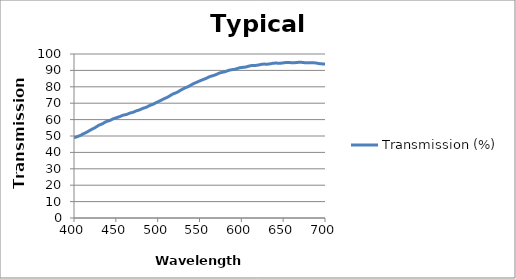
| Category | Transmission (%) |
|---|---|
| 400.0 | 48.969 |
| 401.0 | 49.126 |
| 402.0 | 49.299 |
| 403.0 | 49.397 |
| 404.0 | 49.608 |
| 405.0 | 49.88 |
| 406.0 | 50.022 |
| 407.0 | 50.184 |
| 408.0 | 50.443 |
| 409.0 | 50.691 |
| 410.0 | 51.057 |
| 411.0 | 51.306 |
| 412.0 | 51.488 |
| 413.0 | 51.73 |
| 414.0 | 51.988 |
| 415.0 | 52.292 |
| 416.0 | 52.523 |
| 417.0 | 52.855 |
| 418.0 | 53.106 |
| 419.0 | 53.479 |
| 420.0 | 53.699 |
| 421.0 | 54.022 |
| 422.0 | 54.271 |
| 423.0 | 54.49 |
| 424.0 | 54.793 |
| 425.0 | 55.041 |
| 426.0 | 55.361 |
| 427.0 | 55.71 |
| 428.0 | 55.965 |
| 429.0 | 56.387 |
| 430.0 | 56.599 |
| 431.0 | 56.843 |
| 432.0 | 57.021 |
| 433.0 | 57.22 |
| 434.0 | 57.468 |
| 435.0 | 57.75 |
| 436.0 | 58.072 |
| 437.0 | 58.378 |
| 438.0 | 58.632 |
| 439.0 | 58.861 |
| 440.0 | 59.04 |
| 441.0 | 59.185 |
| 442.0 | 59.311 |
| 443.0 | 59.518 |
| 444.0 | 59.762 |
| 445.0 | 60.007 |
| 446.0 | 60.314 |
| 447.0 | 60.477 |
| 448.0 | 60.676 |
| 449.0 | 60.856 |
| 450.0 | 60.983 |
| 451.0 | 61.18 |
| 452.0 | 61.387 |
| 453.0 | 61.524 |
| 454.0 | 61.702 |
| 455.0 | 61.891 |
| 456.0 | 62.113 |
| 457.0 | 62.354 |
| 458.0 | 62.517 |
| 459.0 | 62.737 |
| 460.0 | 62.84 |
| 461.0 | 62.902 |
| 462.0 | 63.05 |
| 463.0 | 63.176 |
| 464.0 | 63.352 |
| 465.0 | 63.607 |
| 466.0 | 63.81 |
| 467.0 | 63.988 |
| 468.0 | 64.146 |
| 469.0 | 64.267 |
| 470.0 | 64.388 |
| 471.0 | 64.555 |
| 472.0 | 64.759 |
| 473.0 | 65.001 |
| 474.0 | 65.219 |
| 475.0 | 65.399 |
| 476.0 | 65.549 |
| 477.0 | 65.713 |
| 478.0 | 65.88 |
| 479.0 | 66.057 |
| 480.0 | 66.305 |
| 481.0 | 66.548 |
| 482.0 | 66.776 |
| 483.0 | 66.97 |
| 484.0 | 67.118 |
| 485.0 | 67.274 |
| 486.0 | 67.442 |
| 487.0 | 67.683 |
| 488.0 | 67.94 |
| 489.0 | 68.234 |
| 490.0 | 68.466 |
| 491.0 | 68.685 |
| 492.0 | 68.907 |
| 493.0 | 69.094 |
| 494.0 | 69.261 |
| 495.0 | 69.465 |
| 496.0 | 69.738 |
| 497.0 | 69.998 |
| 498.0 | 70.298 |
| 499.0 | 70.531 |
| 500.0 | 70.778 |
| 501.0 | 71.035 |
| 502.0 | 71.275 |
| 503.0 | 71.514 |
| 504.0 | 71.746 |
| 505.0 | 72.029 |
| 506.0 | 72.308 |
| 507.0 | 72.534 |
| 508.0 | 72.793 |
| 509.0 | 73.02 |
| 510.0 | 73.249 |
| 511.0 | 73.473 |
| 512.0 | 73.748 |
| 513.0 | 74.014 |
| 514.0 | 74.325 |
| 515.0 | 74.634 |
| 516.0 | 74.959 |
| 517.0 | 75.263 |
| 518.0 | 75.541 |
| 519.0 | 75.769 |
| 520.0 | 75.959 |
| 521.0 | 76.16 |
| 522.0 | 76.377 |
| 523.0 | 76.609 |
| 524.0 | 76.869 |
| 525.0 | 77.142 |
| 526.0 | 77.482 |
| 527.0 | 77.79 |
| 528.0 | 78.078 |
| 529.0 | 78.361 |
| 530.0 | 78.633 |
| 531.0 | 78.877 |
| 532.0 | 79.136 |
| 533.0 | 79.365 |
| 534.0 | 79.596 |
| 535.0 | 79.783 |
| 536.0 | 80.026 |
| 537.0 | 80.283 |
| 538.0 | 80.529 |
| 539.0 | 80.819 |
| 540.0 | 81.121 |
| 541.0 | 81.411 |
| 542.0 | 81.689 |
| 543.0 | 81.965 |
| 544.0 | 82.207 |
| 545.0 | 82.42 |
| 546.0 | 82.628 |
| 547.0 | 82.831 |
| 548.0 | 83.051 |
| 549.0 | 83.287 |
| 550.0 | 83.511 |
| 551.0 | 83.756 |
| 552.0 | 83.955 |
| 553.0 | 84.142 |
| 554.0 | 84.36 |
| 555.0 | 84.534 |
| 556.0 | 84.728 |
| 557.0 | 84.956 |
| 558.0 | 85.175 |
| 559.0 | 85.443 |
| 560.0 | 85.692 |
| 561.0 | 85.927 |
| 562.0 | 86.17 |
| 563.0 | 86.349 |
| 564.0 | 86.506 |
| 565.0 | 86.633 |
| 566.0 | 86.78 |
| 567.0 | 86.94 |
| 568.0 | 87.089 |
| 569.0 | 87.272 |
| 570.0 | 87.526 |
| 571.0 | 87.736 |
| 572.0 | 87.989 |
| 573.0 | 88.21 |
| 574.0 | 88.412 |
| 575.0 | 88.574 |
| 576.0 | 88.693 |
| 577.0 | 88.804 |
| 578.0 | 88.912 |
| 579.0 | 89.029 |
| 580.0 | 89.14 |
| 581.0 | 89.274 |
| 582.0 | 89.464 |
| 583.0 | 89.657 |
| 584.0 | 89.835 |
| 585.0 | 90.01 |
| 586.0 | 90.156 |
| 587.0 | 90.29 |
| 588.0 | 90.366 |
| 589.0 | 90.451 |
| 590.0 | 90.514 |
| 591.0 | 90.581 |
| 592.0 | 90.683 |
| 593.0 | 90.797 |
| 594.0 | 90.942 |
| 595.0 | 91.112 |
| 596.0 | 91.273 |
| 597.0 | 91.44 |
| 598.0 | 91.596 |
| 599.0 | 91.684 |
| 600.0 | 91.783 |
| 601.0 | 91.804 |
| 602.0 | 91.871 |
| 603.0 | 91.924 |
| 604.0 | 91.96 |
| 605.0 | 92.053 |
| 606.0 | 92.143 |
| 607.0 | 92.291 |
| 608.0 | 92.449 |
| 609.0 | 92.577 |
| 610.0 | 92.729 |
| 611.0 | 92.833 |
| 612.0 | 92.918 |
| 613.0 | 92.987 |
| 614.0 | 92.986 |
| 615.0 | 93.013 |
| 616.0 | 93.015 |
| 617.0 | 93.044 |
| 618.0 | 93.088 |
| 619.0 | 93.157 |
| 620.0 | 93.237 |
| 621.0 | 93.341 |
| 622.0 | 93.481 |
| 623.0 | 93.58 |
| 624.0 | 93.685 |
| 625.0 | 93.766 |
| 626.0 | 93.815 |
| 627.0 | 93.836 |
| 628.0 | 93.829 |
| 629.0 | 93.808 |
| 630.0 | 93.807 |
| 631.0 | 93.811 |
| 632.0 | 93.832 |
| 633.0 | 93.885 |
| 634.0 | 93.962 |
| 635.0 | 94.047 |
| 636.0 | 94.15 |
| 637.0 | 94.26 |
| 638.0 | 94.344 |
| 639.0 | 94.4 |
| 640.0 | 94.433 |
| 641.0 | 94.467 |
| 642.0 | 94.446 |
| 643.0 | 94.421 |
| 644.0 | 94.394 |
| 645.0 | 94.378 |
| 646.0 | 94.389 |
| 647.0 | 94.392 |
| 648.0 | 94.443 |
| 649.0 | 94.521 |
| 650.0 | 94.566 |
| 651.0 | 94.668 |
| 652.0 | 94.741 |
| 653.0 | 94.803 |
| 654.0 | 94.854 |
| 655.0 | 94.864 |
| 656.0 | 94.855 |
| 657.0 | 94.817 |
| 658.0 | 94.787 |
| 659.0 | 94.726 |
| 660.0 | 94.704 |
| 661.0 | 94.678 |
| 662.0 | 94.658 |
| 663.0 | 94.687 |
| 664.0 | 94.713 |
| 665.0 | 94.756 |
| 666.0 | 94.823 |
| 667.0 | 94.86 |
| 668.0 | 94.915 |
| 669.0 | 94.956 |
| 670.0 | 94.934 |
| 671.0 | 94.936 |
| 672.0 | 94.913 |
| 673.0 | 94.845 |
| 674.0 | 94.794 |
| 675.0 | 94.736 |
| 676.0 | 94.691 |
| 677.0 | 94.618 |
| 678.0 | 94.601 |
| 679.0 | 94.583 |
| 680.0 | 94.601 |
| 681.0 | 94.617 |
| 682.0 | 94.623 |
| 683.0 | 94.66 |
| 684.0 | 94.675 |
| 685.0 | 94.675 |
| 686.0 | 94.658 |
| 687.0 | 94.616 |
| 688.0 | 94.578 |
| 689.0 | 94.505 |
| 690.0 | 94.424 |
| 691.0 | 94.33 |
| 692.0 | 94.246 |
| 693.0 | 94.165 |
| 694.0 | 94.075 |
| 695.0 | 94.025 |
| 696.0 | 93.983 |
| 697.0 | 93.971 |
| 698.0 | 93.952 |
| 699.0 | 93.93 |
| 700.0 | 93.906 |